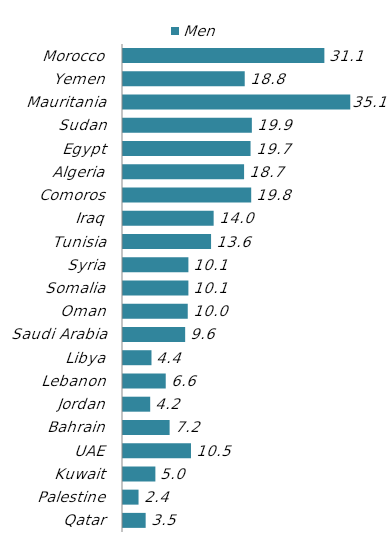
| Category | Men |
|---|---|
| Qatar | 3.5 |
| Palestine | 2.4 |
| Kuwait | 5 |
| UAE | 10.5 |
| Bahrain | 7.2 |
| Jordan | 4.2 |
| Lebanon | 6.6 |
| Libya | 4.4 |
| Saudi Arabia | 9.6 |
| Oman | 10 |
| Somalia | 10.1 |
| Syria | 10.1 |
| Tunisia | 13.6 |
| Iraq | 14 |
| Comoros | 19.8 |
| Algeria | 18.7 |
| Egypt | 19.7 |
| Sudan | 19.9 |
| Mauritania | 35.1 |
| Yemen | 18.8 |
| Morocco | 31.1 |